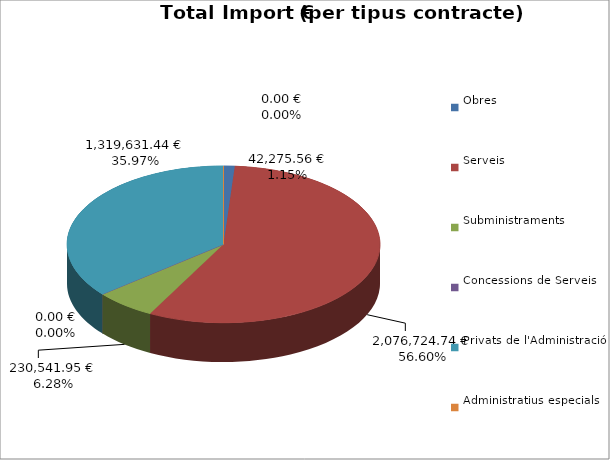
| Category | Total preu
(amb IVA) |
|---|---|
| Obres | 42275.56 |
| Serveis | 2076724.74 |
| Subministraments | 230541.95 |
| Concessions de Serveis | 0 |
| Privats de l'Administració | 1319631.44 |
| Administratius especials | 0 |